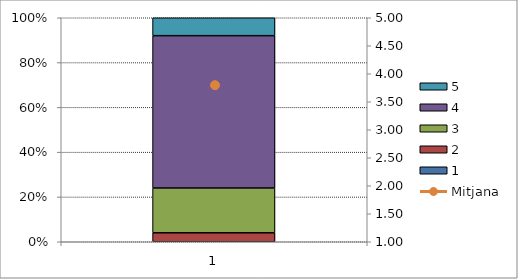
| Category | 1 | 2 | 3 | 4 | 5 |
|---|---|---|---|---|---|
| 0 | 0 | 1 | 5 | 17 | 2 |